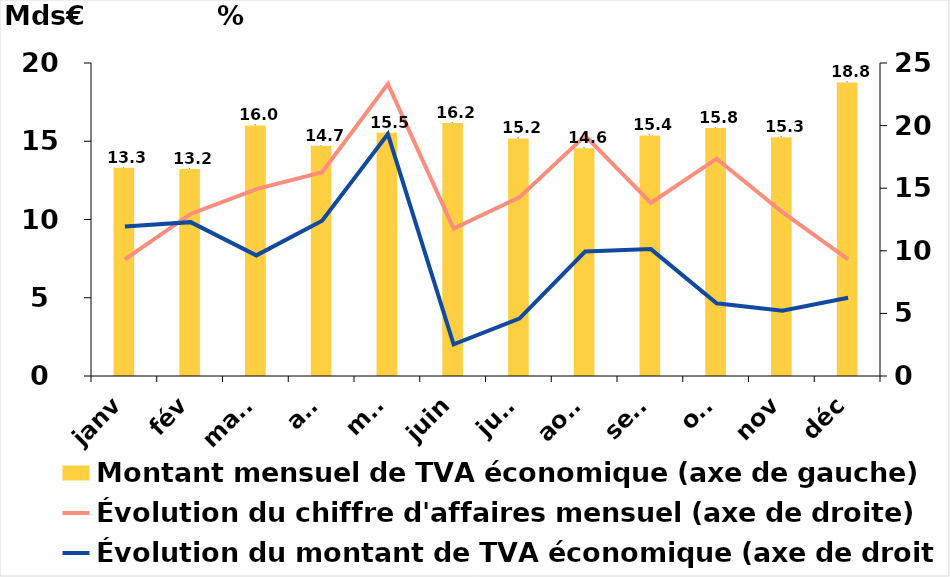
| Category | Montant mensuel de TVA économique (axe de gauche) |
|---|---|
| janv | 13.3 |
| fév | 13.224 |
| mars | 16.011 |
| avr | 14.713 |
| mai | 15.545 |
| juin | 16.16 |
| juil | 15.177 |
| août | 14.555 |
| sept | 15.371 |
| oct | 15.849 |
| nov | 15.261 |
| déc | 18.762 |